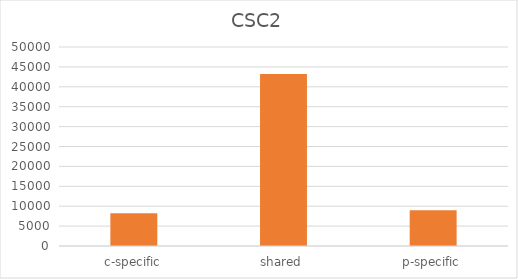
| Category | CSC2 |
|---|---|
| c-specific | 8257 |
| shared | 43214 |
| p-specific | 8953 |